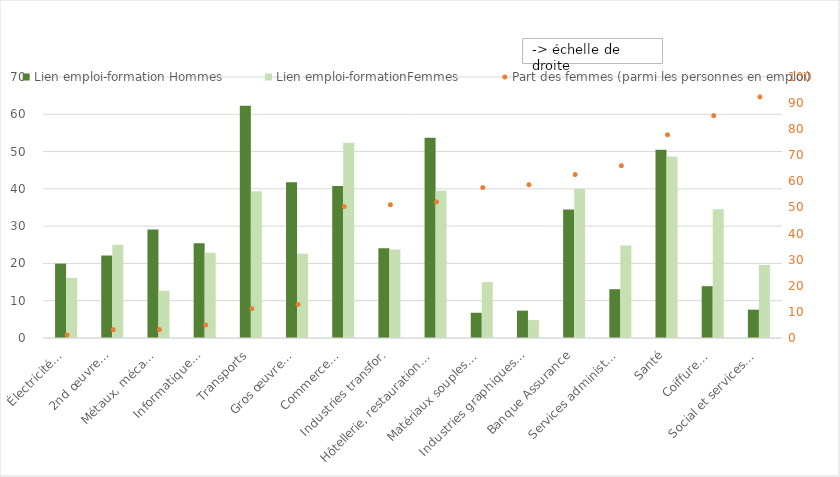
| Category | Lien emploi-formation Hommes | Lien emploi-formationFemmes |
|---|---|---|
| Électricité… | 19.94 | 16.13 |
| 2nd œuvre… | 22.12 | 25 |
| Métaux, méca… | 29.08 | 12.67 |
| Informatique… | 25.39 | 22.86 |
| Transports | 62.26 | 39.38 |
| Gros œuvre… | 41.79 | 22.61 |
| Commerce… | 40.74 | 52.38 |
| Industries transfor. | 24.1 | 23.76 |
| Hôtellerie, restauration… | 53.7 | 39.46 |
| Matériaux souples… | 6.77 | 15.01 |
| Industries graphiques… | 7.33 | 4.82 |
| Banque Assurance | 34.48 | 40 |
| Services administ… | 13.09 | 24.82 |
| Santé | 50.5 | 48.68 |
| Coiffure… | 13.9 | 34.54 |
| Social et services… | 7.6 | 19.58 |